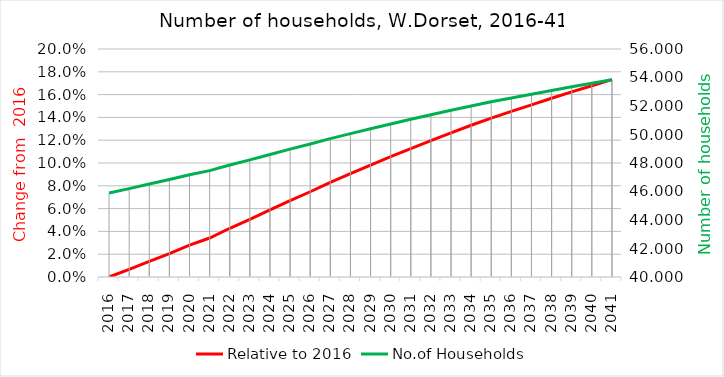
| Category | Relative to 2016 |
|---|---|
| 2016.0 | 0 |
| 2017.0 | 0.007 |
| 2018.0 | 0.014 |
| 2019.0 | 0.021 |
| 2020.0 | 0.028 |
| 2021.0 | 0.034 |
| 2022.0 | 0.043 |
| 2023.0 | 0.051 |
| 2024.0 | 0.059 |
| 2025.0 | 0.067 |
| 2026.0 | 0.075 |
| 2027.0 | 0.083 |
| 2028.0 | 0.091 |
| 2029.0 | 0.098 |
| 2030.0 | 0.106 |
| 2031.0 | 0.113 |
| 2032.0 | 0.12 |
| 2033.0 | 0.126 |
| 2034.0 | 0.133 |
| 2035.0 | 0.139 |
| 2036.0 | 0.145 |
| 2037.0 | 0.151 |
| 2038.0 | 0.157 |
| 2039.0 | 0.162 |
| 2040.0 | 0.168 |
| 2041.0 | 0.173 |